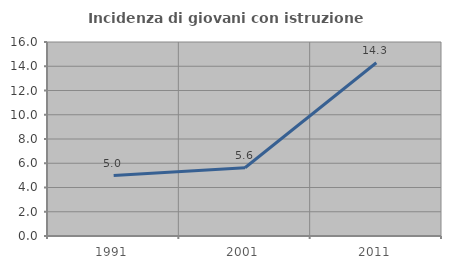
| Category | Incidenza di giovani con istruzione universitaria |
|---|---|
| 1991.0 | 4.983 |
| 2001.0 | 5.628 |
| 2011.0 | 14.286 |